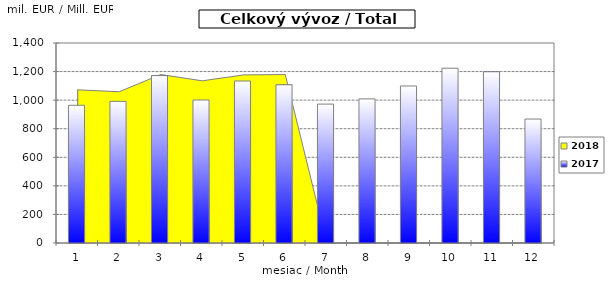
| Category | 2017 |
|---|---|
| 0 | 963.986 |
| 1 | 991.484 |
| 2 | 1171.783 |
| 3 | 1000.934 |
| 4 | 1133.915 |
| 5 | 1107.672 |
| 6 | 972.245 |
| 7 | 1008.695 |
| 8 | 1099.173 |
| 9 | 1223.513 |
| 10 | 1198.82 |
| 11 | 867.606 |